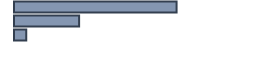
| Category | Percentatge |
|---|---|
| 0 | 67.739 |
| 1 | 27.13 |
| 2 | 5.13 |